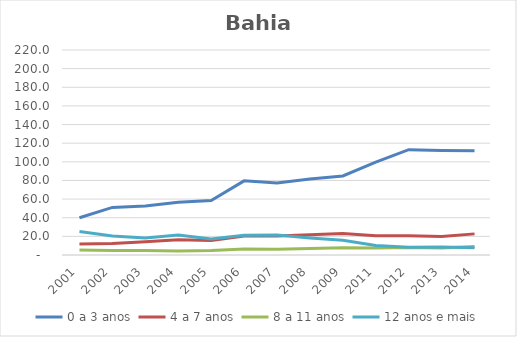
| Category | 0 a 3 anos | 4 a 7 anos | 8 a 11 anos | 12 anos e mais |
|---|---|---|---|---|
| 2001.0 | 39.963 | 11.763 | 5.434 | 25.187 |
| 2002.0 | 51.086 | 12.321 | 4.745 | 20.429 |
| 2003.0 | 52.593 | 14.244 | 4.822 | 18.279 |
| 2004.0 | 56.686 | 16.331 | 4.335 | 21.381 |
| 2005.0 | 58.563 | 15.537 | 4.864 | 17.107 |
| 2006.0 | 79.578 | 20.349 | 6.426 | 21.315 |
| 2007.0 | 77.259 | 20.333 | 6.087 | 21.456 |
| 2008.0 | 81.441 | 21.734 | 6.95 | 18.287 |
| 2009.0 | 84.869 | 23.077 | 7.759 | 15.789 |
| 2011.0 | 99.612 | 20.765 | 7.502 | 10.248 |
| 2012.0 | 113.059 | 20.632 | 8.02 | 8.362 |
| 2013.0 | 112.21 | 19.946 | 7.437 | 8.49 |
| 2014.0 | 111.933 | 22.667 | 9.202 | 7.736 |